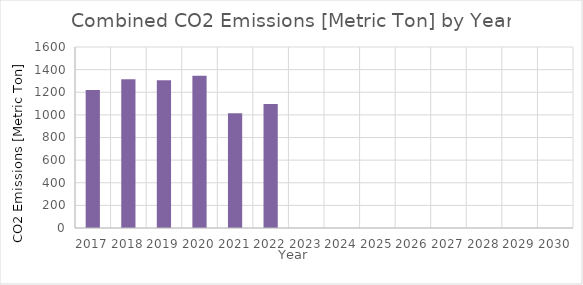
| Category | Total |
|---|---|
| 2017.0 | 1218.9 |
| 2018.0 | 1315.858 |
| 2019.0 | 1305.649 |
| 2020.0 | 1345.28 |
| 2021.0 | 1013.487 |
| 2022.0 | 1097.053 |
| 2023.0 | 0 |
| 2024.0 | 0 |
| 2025.0 | 0 |
| 2026.0 | 0 |
| 2027.0 | 0 |
| 2028.0 | 0 |
| 2029.0 | 0 |
| 2030.0 | 0 |